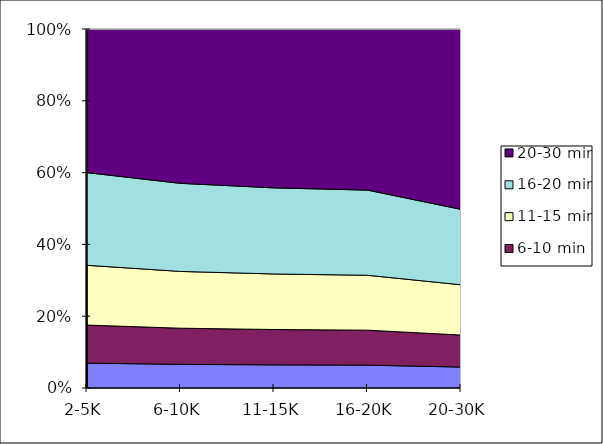
| Category | 2-5 min | 6-10 min | 11-15 min | 16-20 min | 20-30 min |
|---|---|---|---|---|---|
| 2-5K | 1112 | 1699 | 2670 | 4140 | 6418 |
| 6-10K | 1245 | 1903 | 2990 | 4637 | 8127 |
| 11-15K | 1395 | 2131 | 3349 | 5193 | 9579 |
| 16-20K | 1562 | 2387 | 3751 | 5816 | 11002 |
| 20-30K | 1750 | 2673 | 4201 | 6300 | 15071 |